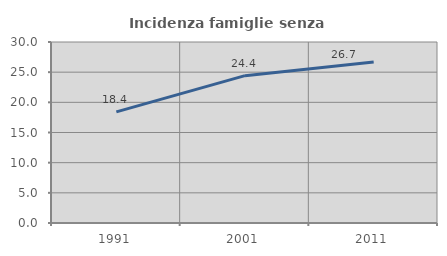
| Category | Incidenza famiglie senza nuclei |
|---|---|
| 1991.0 | 18.423 |
| 2001.0 | 24.422 |
| 2011.0 | 26.698 |